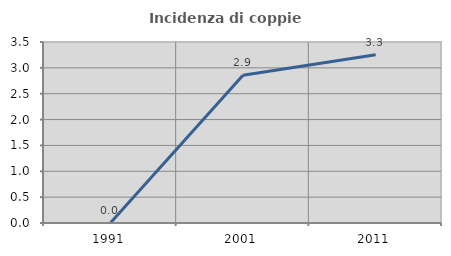
| Category | Incidenza di coppie miste |
|---|---|
| 1991.0 | 0 |
| 2001.0 | 2.857 |
| 2011.0 | 3.252 |